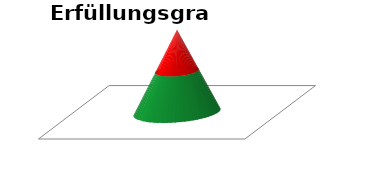
| Category | Series 1 | Series 0 |
|---|---|---|
| 0 | 2 | 2 |